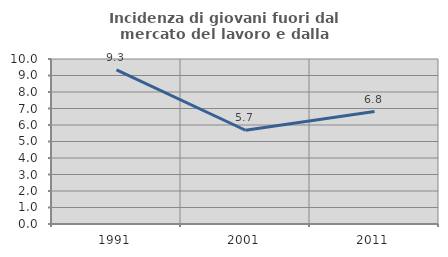
| Category | Incidenza di giovani fuori dal mercato del lavoro e dalla formazione  |
|---|---|
| 1991.0 | 9.346 |
| 2001.0 | 5.682 |
| 2011.0 | 6.818 |